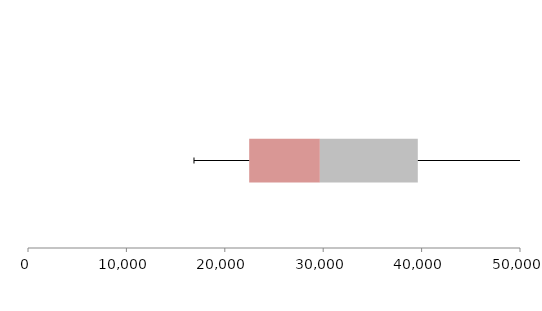
| Category | Series 1 | Series 2 | Series 3 |
|---|---|---|---|
| 0 | 22479.044 | 7182.554 | 9952.677 |